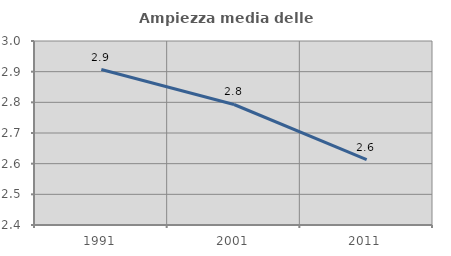
| Category | Ampiezza media delle famiglie |
|---|---|
| 1991.0 | 2.907 |
| 2001.0 | 2.793 |
| 2011.0 | 2.614 |